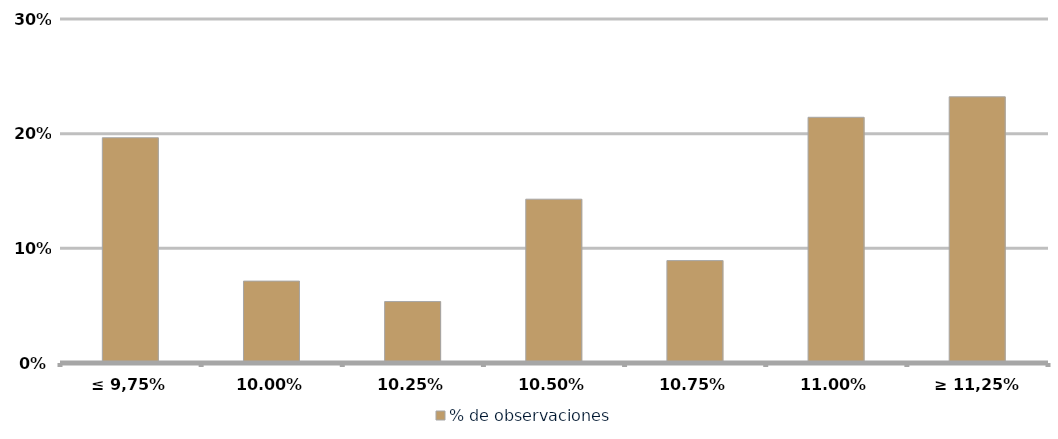
| Category | % de observaciones  |
|---|---|
| ≤ 9,75% | 0.196 |
| 10,00% | 0.071 |
| 10,25% | 0.054 |
| 10,50% | 0.143 |
| 10,75% | 0.089 |
| 11,00% | 0.214 |
| ≥ 11,25% | 0.232 |